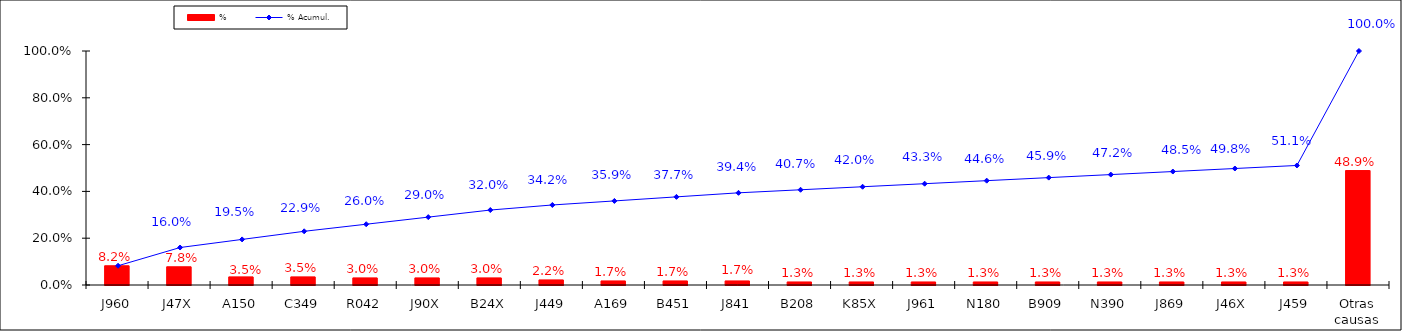
| Category | % |
|---|---|
| J960 | 0.082 |
| J47X | 0.078 |
| A150 | 0.035 |
| C349 | 0.035 |
| R042 | 0.03 |
| J90X | 0.03 |
| B24X | 0.03 |
| J449 | 0.022 |
| A169 | 0.017 |
| B451 | 0.017 |
| J841 | 0.017 |
| B208 | 0.013 |
| K85X | 0.013 |
| J961 | 0.013 |
| N180 | 0.013 |
| B909 | 0.013 |
| N390 | 0.013 |
| J869 | 0.013 |
| J46X | 0.013 |
| J459 | 0.013 |
| Otras causas | 0.489 |